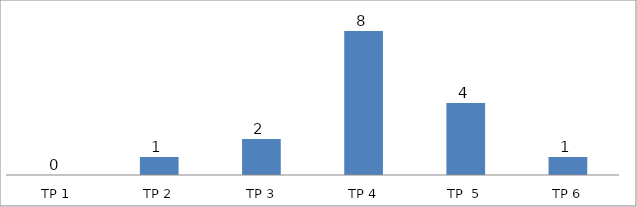
| Category | BIL. MURID |
|---|---|
| TP 1 | 0 |
| TP 2 | 1 |
|  TP 3 | 2 |
| TP 4 | 8 |
| TP  5 | 4 |
| TP 6 | 1 |